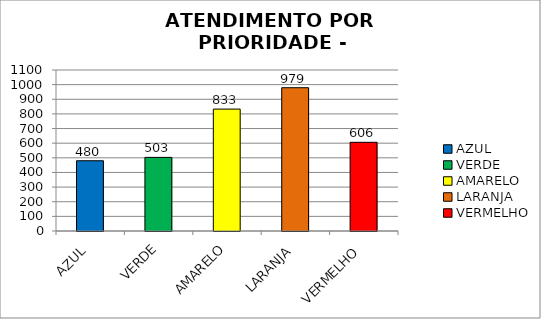
| Category | Total Regional: |
|---|---|
| AZUL | 480 |
| VERDE | 503 |
| AMARELO | 833 |
| LARANJA | 979 |
| VERMELHO | 606 |